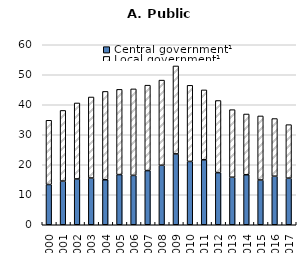
| Category | Central government¹ | Local government¹ |
|---|---|---|
| 2000.0 | 13.413 | 21.42 |
| 2001.0 | 14.563 | 23.548 |
| 2002.0 | 15.275 | 25.322 |
| 2003.0 | 15.586 | 27.002 |
| 2004.0 | 14.99 | 29.465 |
| 2005.0 | 16.727 | 28.413 |
| 2006.0 | 16.455 | 28.836 |
| 2007.0 | 18.06 | 28.471 |
| 2008.0 | 19.833 | 28.381 |
| 2009.0 | 23.625 | 29.311 |
| 2010.0 | 21.111 | 25.372 |
| 2011.0 | 21.647 | 23.305 |
| 2012.0 | 17.376 | 24.045 |
| 2013.0 | 15.847 | 22.52 |
| 2014.0 | 16.675 | 20.244 |
| 2015.0 | 14.921 | 21.353 |
| 2016.0 | 16.197 | 19.207 |
| 2017.0 | 15.538 | 17.836 |